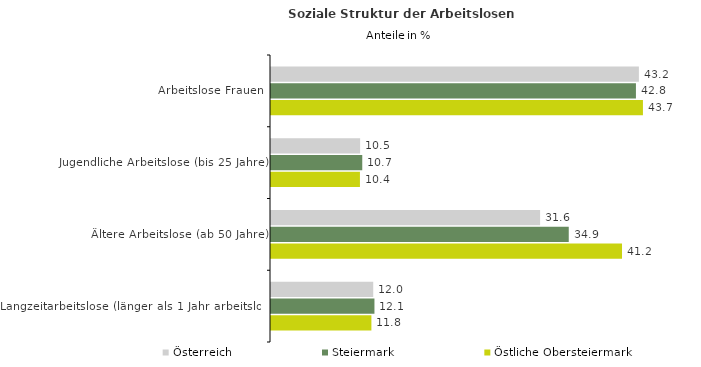
| Category | Österreich | Steiermark | Östliche Obersteiermark |
|---|---|---|---|
| Arbeitslose Frauen | 43.18 | 42.833 | 43.655 |
| Jugendliche Arbeitslose (bis 25 Jahre) | 10.46 | 10.711 | 10.439 |
| Ältere Arbeitslose (ab 50 Jahre) | 31.584 | 34.947 | 41.199 |
| Langzeitarbeitslose (länger als 1 Jahr arbeitslos) | 11.999 | 12.142 | 11.784 |